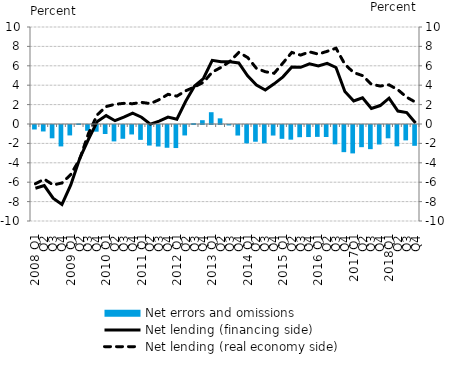
| Category | Net errors and omissions |
|---|---|
| 2008 Q1 | -0.462 |
| Q2 | -0.666 |
| Q3 | -1.371 |
| Q4 | -2.208 |
| 2009 Q1 | -1.075 |
| Q2 | 0.056 |
| Q3 | -0.595 |
| Q4 | -0.688 |
| 2010 Q1 | -0.929 |
| Q2 | -1.692 |
| Q3 | -1.42 |
| Q4 | -0.975 |
| 2011 Q1 | -1.533 |
| Q2 | -2.118 |
| Q3 | -2.221 |
| Q4 | -2.347 |
| 2012 Q1 | -2.376 |
| Q2 | -1.077 |
| Q3 | 0.091 |
| Q4 | 0.393 |
| 2013 Q1 | 1.215 |
| Q2 | 0.583 |
| Q3 | -0.044 |
| Q4 | -1.086 |
| 2014 Q1 | -1.893 |
| Q2 | -1.724 |
| Q3 | -1.892 |
| Q4 | -1.087 |
| 2015 Q1 | -1.425 |
| Q2 | -1.511 |
| Q3 | -1.258 |
| Q4 | -1.242 |
| 2016 Q1 | -1.224 |
| Q2 | -1.236 |
| Q3 | -1.992 |
| Q4 | -2.799 |
| 2017Q1 | -2.928 |
| Q2 | -2.286 |
| Q3 | -2.491 |
| Q4 | -2.011 |
| 2018Q1 | -1.372 |
| Q2 | -2.197 |
| Q3 | -1.586 |
| Q4 | -2.146 |